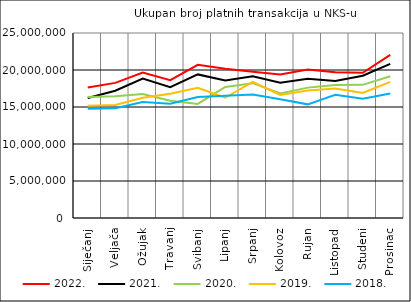
| Category | 2022. | 2021. | 2020. | 2019. | 2018. |
|---|---|---|---|---|---|
| Siječanj | 17650229 | 16221327 | 16346123 | 15174524 | 14757807 |
| Veljača | 18258849 | 17192566 | 16445144 | 15276533 | 14822755 |
| Ožujak | 19663551 | 18832462 | 16758138 | 16252635 | 15687333 |
| Travanj | 18619917 | 17679568 | 15853226 | 16786481 | 15445835 |
| Svibanj | 20696889 | 19402438 | 15413590 | 17596535 | 16338793 |
| Lipanj | 20175242 | 18571347 | 17701142 | 16249335 | 16523063 |
| Srpanj | 19758352 | 19160828 | 18222679 | 18397147 | 16700818 |
| Kolovoz | 19409282 | 18281831 | 16837389 | 16637568 | 16046591 |
| Rujan | 20059949 | 18829227 | 17618815 | 17224927 | 15358831 |
| Listopad | 19685402 | 18525892 | 17987969 | 17508338 | 16658115 |
| Studeni | 19619037 | 19221512 | 17991645 | 16897604 | 16131518 |
| Prosinac | 22050970 | 20820693 | 19158576 | 18390136 | 16837884 |